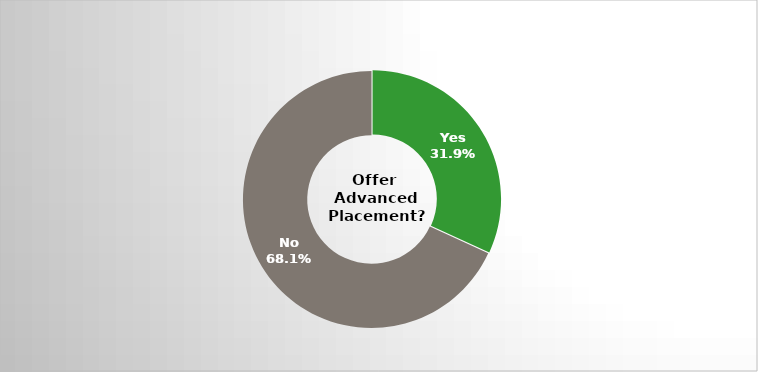
| Category | Series 0 |
|---|---|
| Yes | 0.319 |
| No | 0.681 |